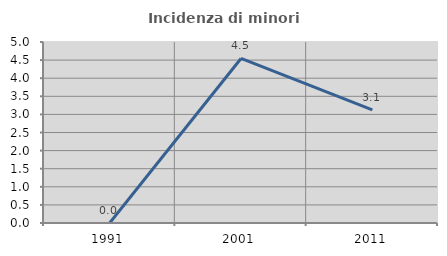
| Category | Incidenza di minori stranieri |
|---|---|
| 1991.0 | 0 |
| 2001.0 | 4.545 |
| 2011.0 | 3.125 |